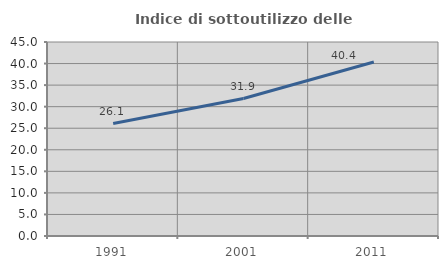
| Category | Indice di sottoutilizzo delle abitazioni  |
|---|---|
| 1991.0 | 26.078 |
| 2001.0 | 31.883 |
| 2011.0 | 40.354 |